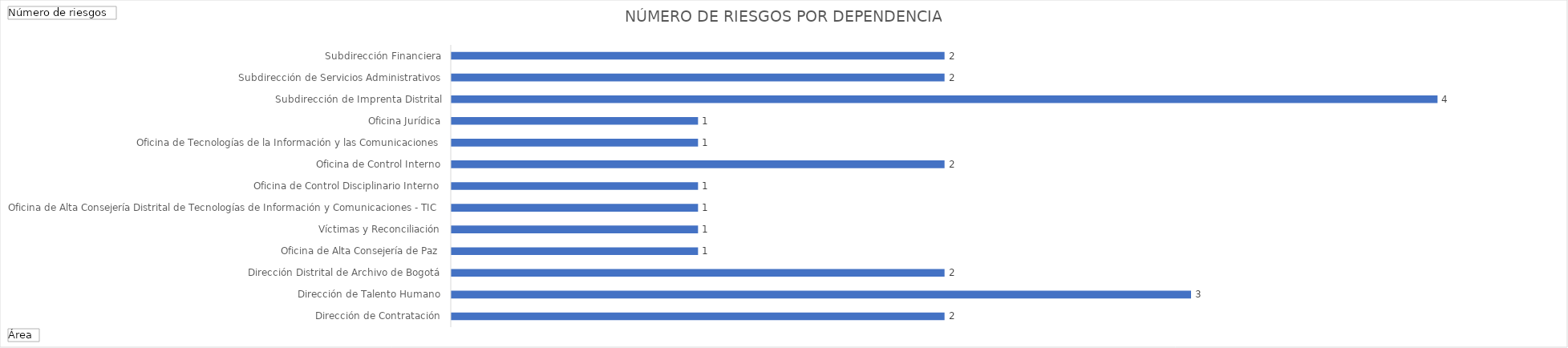
| Category | Total |
|---|---|
| Dirección de Contratación | 2 |
| Dirección de Talento Humano | 3 |
| Dirección Distrital de Archivo de Bogotá | 2 |
| Oficina de Alta Consejería de Paz, Víctimas y Reconciliación | 1 |
| Oficina de Alta Consejería Distrital de Tecnologías de Información y Comunicaciones - TIC | 1 |
| Oficina de Control Disciplinario Interno | 1 |
| Oficina de Control Interno | 1 |
| Oficina de Tecnologías de la Información y las Comunicaciones | 2 |
| Oficina Jurídica | 1 |
| Subdirección de Imprenta Distrital | 1 |
| Subdirección de Servicios Administrativos | 4 |
| Subdirección Financiera | 2 |
| Subsecretaría de Servicio a la Ciudadanía | 2 |